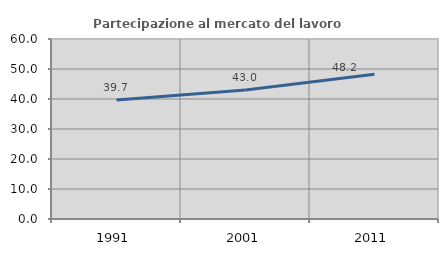
| Category | Partecipazione al mercato del lavoro  femminile |
|---|---|
| 1991.0 | 39.68 |
| 2001.0 | 43.008 |
| 2011.0 | 48.218 |